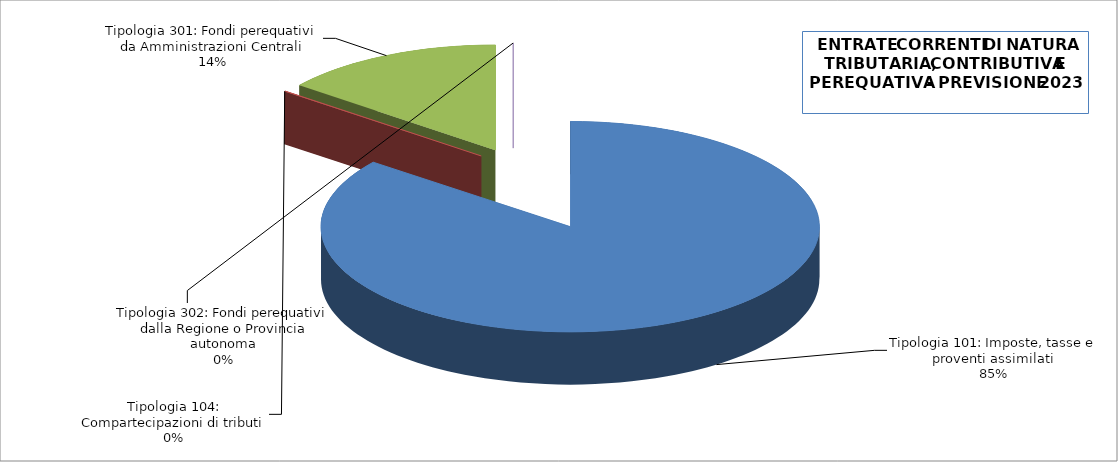
| Category | Series 0 |
|---|---|
| Tipologia 101: Imposte, tasse e proventi assimilati | 18276794 |
| Tipologia 104: Compartecipazioni di tributi | 20000 |
| Tipologia 301: Fondi perequativi da Amministrazioni Centrali | 3081373 |
| Tipologia 302: Fondi perequativi dalla Regione o Provincia autonoma | 0 |